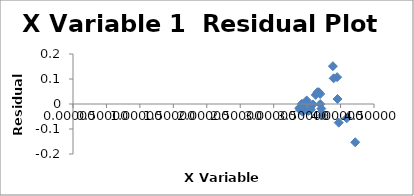
| Category | Series 0 |
|---|---|
| 4.219453537076811 | -0.153 |
| 4.092896010921856 | -0.057 |
| 3.973174052682972 | -0.075 |
| 3.954483717155552 | 0.02 |
| 3.9486085498764365 | 0.107 |
| 3.8967466156074058 | 0.103 |
| 3.8854177651109363 | 0.151 |
| 3.728110184100341 | -0.045 |
| 3.7131544018372984 | -0.018 |
| 3.6962689967455327 | 0 |
| 3.6955692270361857 | 0.04 |
| 3.67641923171836 | 0.047 |
| 3.655042341331202 | 0.047 |
| 3.628491104967123 | 0.036 |
| 3.586587304671755 | -0.002 |
| 3.5559404378185113 | -0.023 |
| 3.5443161417474274 | -0.016 |
| 3.521530341278711 | -0.028 |
| 3.519302849235429 | -0.008 |
| 3.5101426994025733 | 0 |
| 3.498861688992884 | 0.003 |
| 3.493597449000527 | 0.014 |
| 3.472171146692363 | -0.001 |
| 3.445136968713304 | -0.026 |
| 3.431524584187451 | -0.031 |
| 3.42845877351558 | -0.019 |
| 3.424718337331567 | -0.008 |
| 3.4204508591060683 | 0.001 |
| 3.395675785269936 | -0.024 |
| 3.3902283624691303 | -0.018 |
| 3.382917135087531 | -0.016 |